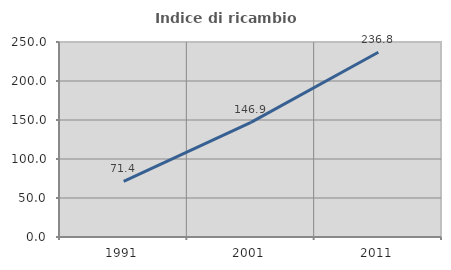
| Category | Indice di ricambio occupazionale  |
|---|---|
| 1991.0 | 71.357 |
| 2001.0 | 146.903 |
| 2011.0 | 236.842 |